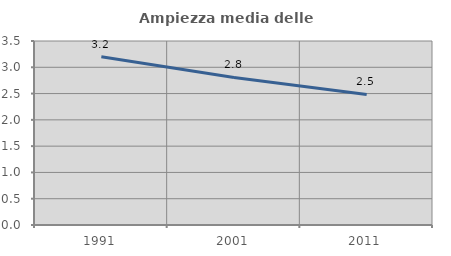
| Category | Ampiezza media delle famiglie |
|---|---|
| 1991.0 | 3.202 |
| 2001.0 | 2.807 |
| 2011.0 | 2.483 |